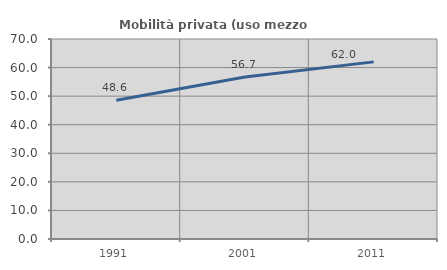
| Category | Mobilità privata (uso mezzo privato) |
|---|---|
| 1991.0 | 48.583 |
| 2001.0 | 56.734 |
| 2011.0 | 61.997 |